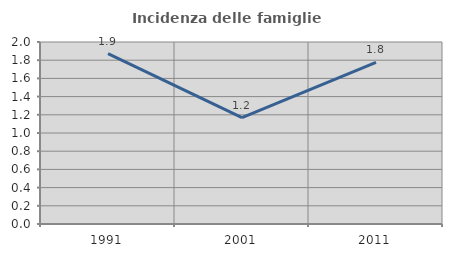
| Category | Incidenza delle famiglie numerose |
|---|---|
| 1991.0 | 1.872 |
| 2001.0 | 1.169 |
| 2011.0 | 1.777 |